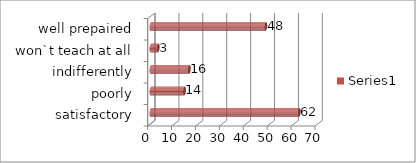
| Category | Series 0 |
|---|---|
| satisfactory | 62 |
| poorly | 14 |
| indifferently | 16 |
| won`t teach at all | 3 |
| well prepaired | 48 |